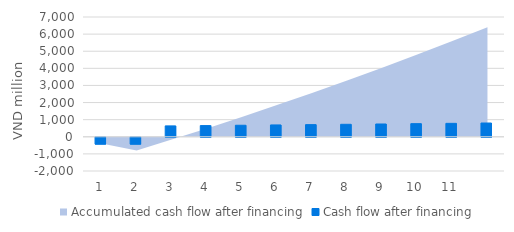
| Category | Cash flow after financing |
|---|---|
| 1.0 | -400 |
| 2.0 | -400 |
| 3.0 | 635.428 |
| 4.0 | 654.111 |
| 5.0 | 672.795 |
| 6.0 | 691.479 |
| 7.0 | 710.163 |
| 8.0 | 728.846 |
| 9.0 | 747.53 |
| 10.0 | 766.214 |
| 11.0 | 784.898 |